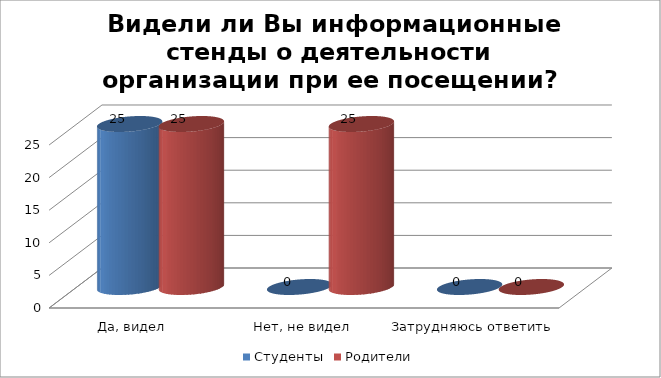
| Category | Студенты | Родители |
|---|---|---|
| Да, видел | 25 | 25 |
| Нет, не видел | 0 | 25 |
| Затрудняюсь ответить | 0 | 0 |